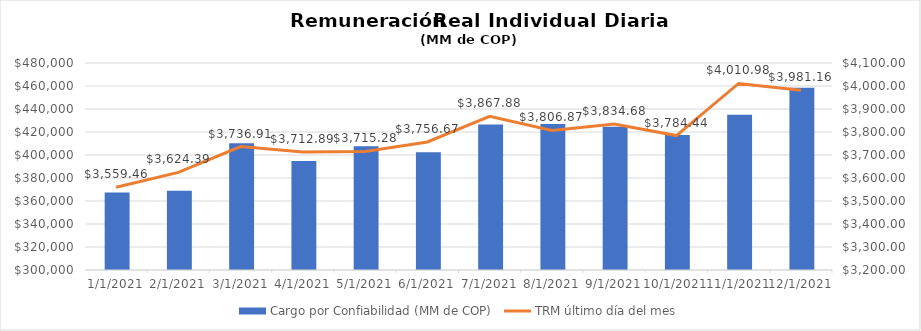
| Category | Cargo por Confiabilidad (MM de COP) |
|---|---|
| 1/1/21 | 367453.208 |
| 2/1/21 | 368829.817 |
| 3/1/21 | 410292.562 |
| 4/1/21 | 394880.844 |
| 5/1/21 | 407615.42 |
| 6/1/21 | 402416.554 |
| 7/1/21 | 426518.94 |
| 8/1/21 | 426848.24 |
| 9/1/21 | 424622.929 |
| 10/1/21 | 417485.815 |
| 11/1/21 | 434906.727 |
| 12/1/21 | 458578.711 |